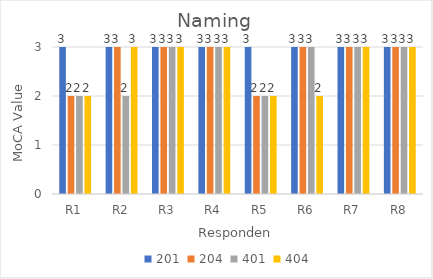
| Category | 201 | 204 | 401 | 404 |
|---|---|---|---|---|
| R1 | 3 | 2 | 2 | 2 |
| R2 | 3 | 3 | 2 | 3 |
| R3 | 3 | 3 | 3 | 3 |
| R4 | 3 | 3 | 3 | 3 |
| R5 | 3 | 2 | 2 | 2 |
| R6 | 3 | 3 | 3 | 2 |
| R7 | 3 | 3 | 3 | 3 |
| R8 | 3 | 3 | 3 | 3 |